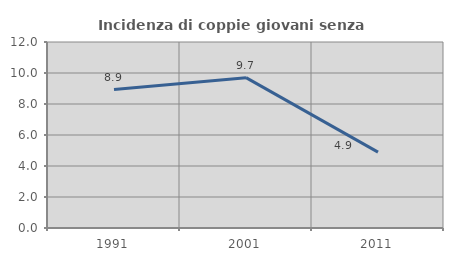
| Category | Incidenza di coppie giovani senza figli |
|---|---|
| 1991.0 | 8.935 |
| 2001.0 | 9.701 |
| 2011.0 | 4.898 |